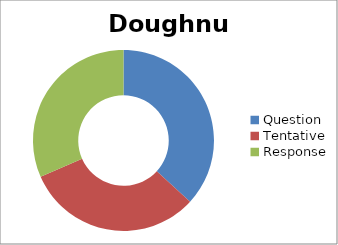
| Category | Series 0 |
|---|---|
| Question | 35 |
| Tentative | 30 |
| Response | 30 |